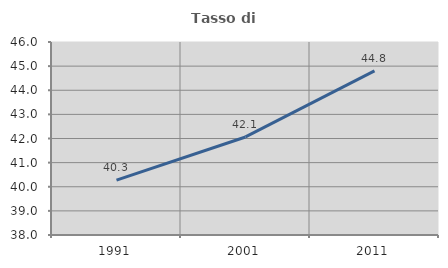
| Category | Tasso di occupazione   |
|---|---|
| 1991.0 | 40.274 |
| 2001.0 | 42.064 |
| 2011.0 | 44.806 |